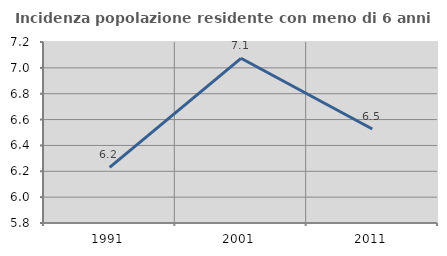
| Category | Incidenza popolazione residente con meno di 6 anni |
|---|---|
| 1991.0 | 6.23 |
| 2001.0 | 7.074 |
| 2011.0 | 6.527 |